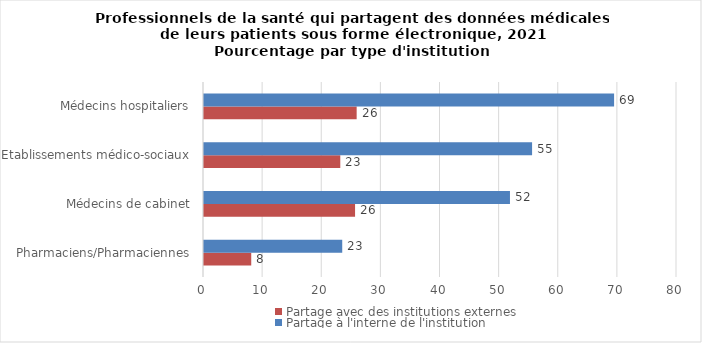
| Category | Partage avec des institutions externes | Partage à l'interne de l'institution |
|---|---|---|
| Pharmaciens/Pharmaciennes | 7.99 | 23.38 |
| Médecins de cabinet | 25.55 | 51.75 |
| Etablissements médico-sociaux | 23.05 | 55.49 |
| Médecins hospitaliers | 25.82 | 69.36 |